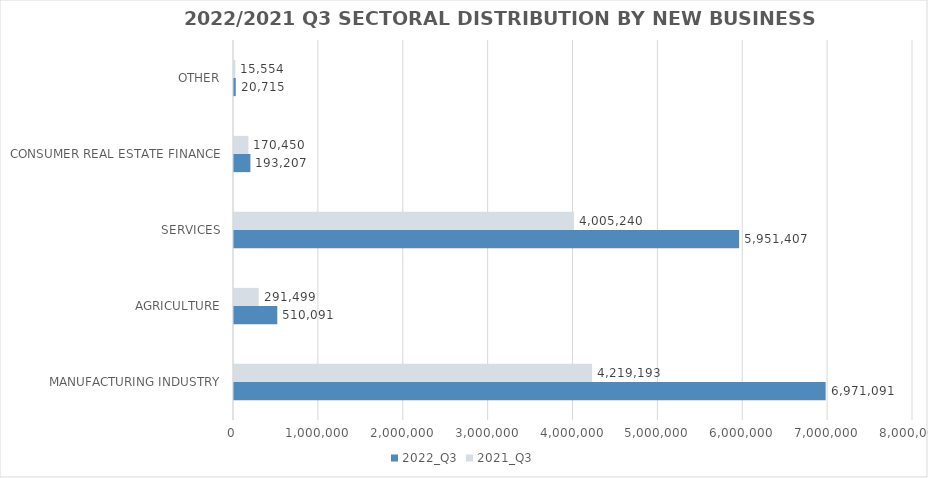
| Category | 2022_Q3 | 2021_Q3 |
|---|---|---|
| MANUFACTURING INDUSTRY | 6971090.586 | 4219193.223 |
| AGRICULTURE | 510090.841 | 291499.276 |
| SERVICES | 5951407.105 | 4005239.943 |
| CONSUMER REAL ESTATE FINANCE | 193207 | 170450 |
| OTHER | 20715 | 15554 |